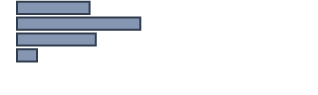
| Category | Series 0 |
|---|---|
| 0 | 24.6 |
| 1 | 41.8 |
| 2 | 26.7 |
| 3 | 6.8 |
| 4 | 0 |